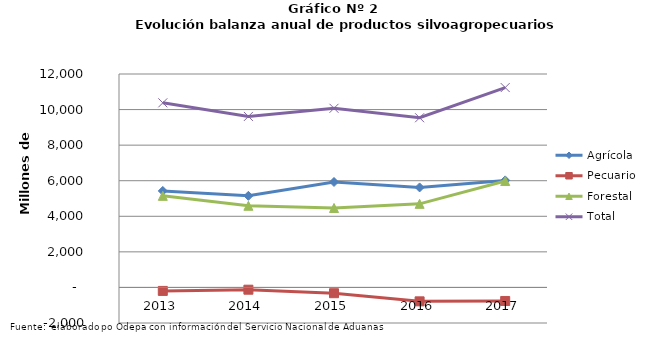
| Category | Agrícola | Pecuario | Forestal | Total |
|---|---|---|---|---|
| 2013.0 | 5424524 | -195643 | 5149868 | 10378749 |
| 2014.0 | 5149872 | -127785 | 4591408 | 9613495 |
| 2015.0 | 5928552 | -325380 | 4468104 | 10071276 |
| 2016.0 | 5622794 | -782588 | 4700192 | 9540398 |
| 2017.0 | 6017573 | -762092 | 5982541 | 11238022 |